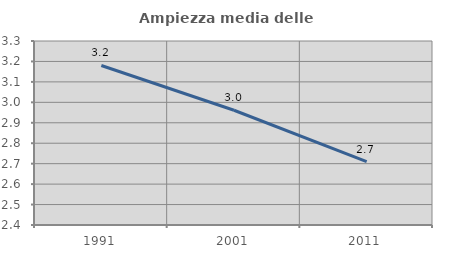
| Category | Ampiezza media delle famiglie |
|---|---|
| 1991.0 | 3.18 |
| 2001.0 | 2.961 |
| 2011.0 | 2.71 |